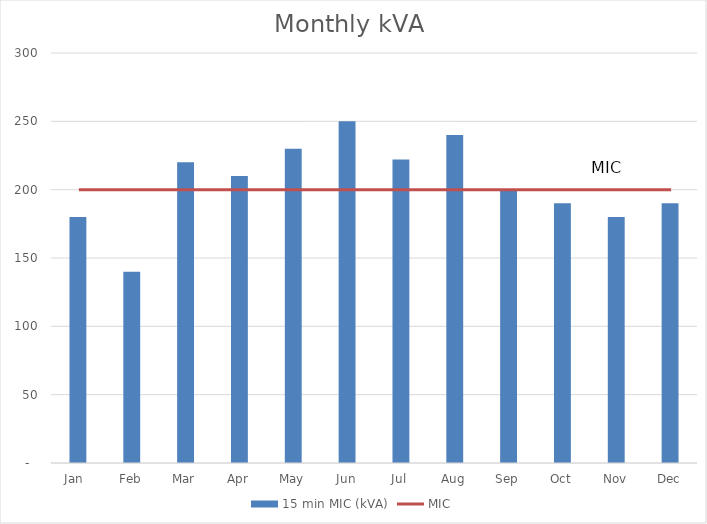
| Category | 15 min MIC (kVA) |
|---|---|
| Jan  | 180 |
| Feb | 140 |
| Mar | 220 |
| Apr | 210 |
| May | 230 |
| Jun | 250 |
| Jul | 222 |
| Aug | 240 |
| Sep | 200 |
| Oct | 190 |
| Nov | 180 |
| Dec | 190 |